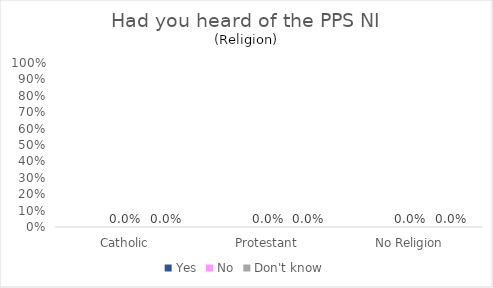
| Category | Yes | No | Don't know |
|---|---|---|---|
| Catholic | 0 | 0 | 0 |
| Protestant | 0 | 0 | 0 |
| No Religion | 0 | 0 | 0 |